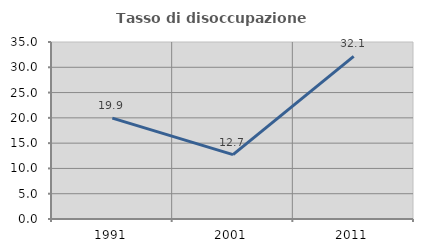
| Category | Tasso di disoccupazione giovanile  |
|---|---|
| 1991.0 | 19.943 |
| 2001.0 | 12.719 |
| 2011.0 | 32.143 |